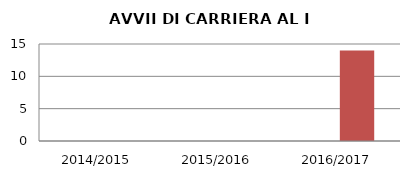
| Category | ANNO | NUMERO |
|---|---|---|
| 2014/2015 | 0 | 0 |
| 2015/2016 | 0 | 0 |
| 2016/2017 | 0 | 14 |